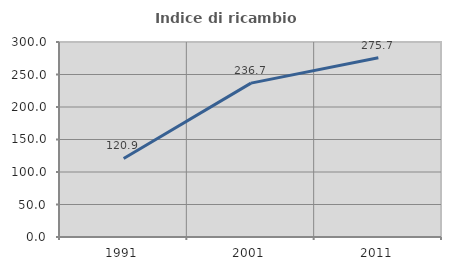
| Category | Indice di ricambio occupazionale  |
|---|---|
| 1991.0 | 120.892 |
| 2001.0 | 236.723 |
| 2011.0 | 275.676 |